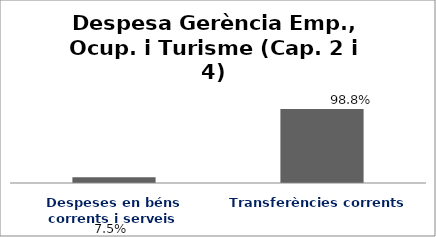
| Category | Series 0 |
|---|---|
| Despeses en béns corrents i serveis | 0.075 |
| Transferències corrents | 0.988 |